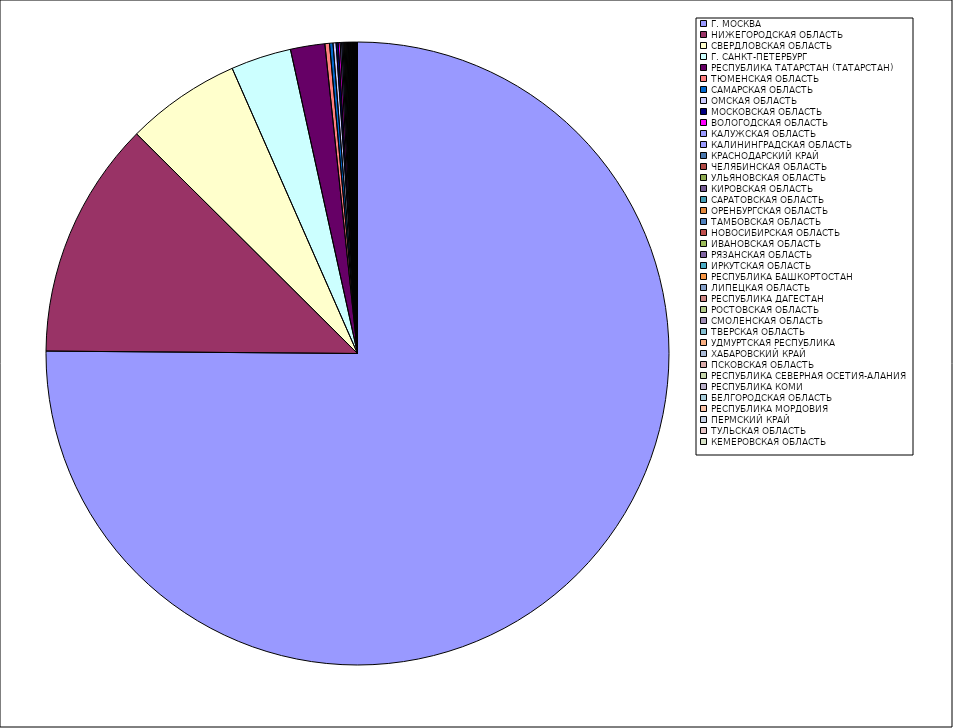
| Category | Оборот |
|---|---|
| Г. МОСКВА | 75.082 |
| НИЖЕГОРОДСКАЯ ОБЛАСТЬ | 12.323 |
| СВЕРДЛОВСКАЯ ОБЛАСТЬ | 5.953 |
| Г. САНКТ-ПЕТЕРБУРГ | 3.133 |
| РЕСПУБЛИКА ТАТАРСТАН (ТАТАРСТАН) | 1.782 |
| ТЮМЕНСКАЯ ОБЛАСТЬ | 0.238 |
| САМАРСКАЯ ОБЛАСТЬ | 0.179 |
| ОМСКАЯ ОБЛАСТЬ | 0.157 |
| МОСКОВСКАЯ ОБЛАСТЬ | 0.108 |
| ВОЛОГОДСКАЯ ОБЛАСТЬ | 0.101 |
| КАЛУЖСКАЯ ОБЛАСТЬ | 0.078 |
| КАЛИНИНГРАДСКАЯ ОБЛАСТЬ | 0.06 |
| КРАСНОДАРСКИЙ КРАЙ | 0.056 |
| ЧЕЛЯБИНСКАЯ ОБЛАСТЬ | 0.049 |
| УЛЬЯНОВСКАЯ ОБЛАСТЬ | 0.048 |
| КИРОВСКАЯ ОБЛАСТЬ | 0.045 |
| САРАТОВСКАЯ ОБЛАСТЬ | 0.042 |
| ОРЕНБУРГСКАЯ ОБЛАСТЬ | 0.039 |
| ТАМБОВСКАЯ ОБЛАСТЬ | 0.037 |
| НОВОСИБИРСКАЯ ОБЛАСТЬ | 0.036 |
| ИВАНОВСКАЯ ОБЛАСТЬ | 0.036 |
| РЯЗАНСКАЯ ОБЛАСТЬ | 0.035 |
| ИРКУТСКАЯ ОБЛАСТЬ | 0.034 |
| РЕСПУБЛИКА БАШКОРТОСТАН | 0.034 |
| ЛИПЕЦКАЯ ОБЛАСТЬ | 0.029 |
| РЕСПУБЛИКА ДАГЕСТАН | 0.028 |
| РОСТОВСКАЯ ОБЛАСТЬ | 0.025 |
| СМОЛЕНСКАЯ ОБЛАСТЬ | 0.024 |
| ТВЕРСКАЯ ОБЛАСТЬ | 0.023 |
| УДМУРТСКАЯ РЕСПУБЛИКА | 0.023 |
| ХАБАРОВСКИЙ КРАЙ | 0.018 |
| ПСКОВСКАЯ ОБЛАСТЬ | 0.017 |
| РЕСПУБЛИКА СЕВЕРНАЯ ОСЕТИЯ-АЛАНИЯ | 0.013 |
| РЕСПУБЛИКА КОМИ | 0.012 |
| БЕЛГОРОДСКАЯ ОБЛАСТЬ | 0.011 |
| РЕСПУБЛИКА МОРДОВИЯ | 0.01 |
| ПЕРМСКИЙ КРАЙ | 0.009 |
| ТУЛЬСКАЯ ОБЛАСТЬ | 0.008 |
| КЕМЕРОВСКАЯ ОБЛАСТЬ | 0.007 |